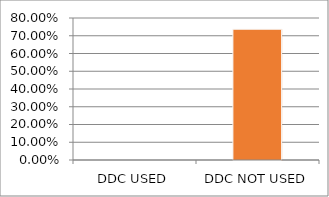
| Category | Series 0 |
|---|---|
| DDC USED | 0 |
| DDC NOT USED | 0.737 |